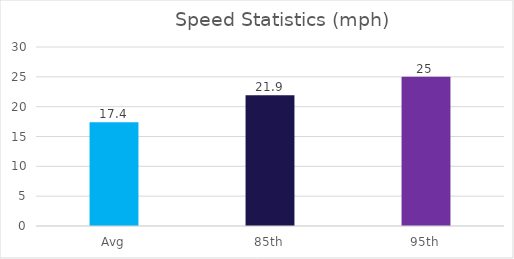
| Category | Series 0 |
|---|---|
| Avg | 17.4 |
| 85th | 21.9 |
| 95th | 25 |